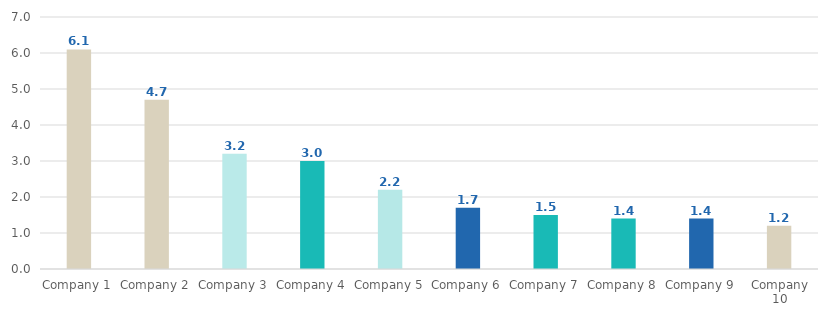
| Category | Series 0 |
|---|---|
| Company 1 | 6.1 |
| Company 2 | 4.7 |
| Company 3 | 3.2 |
| Company 4 | 3 |
| Company 5 | 2.2 |
| Company 6 | 1.7 |
| Company 7 | 1.5 |
| Company 8 | 1.4 |
| Company 9 | 1.4 |
| Company 10 | 1.2 |